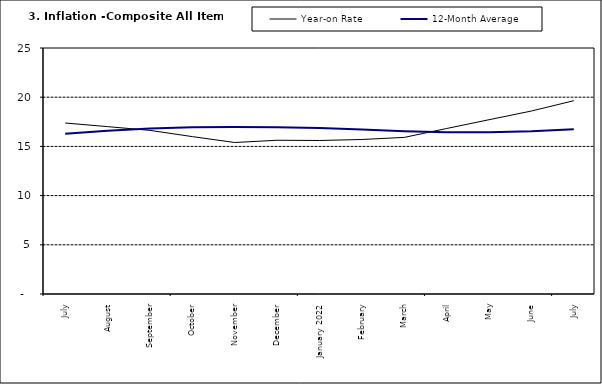
| Category | Year-on Rate | 12-Month Average |
|---|---|---|
| July | 17.377 | 16.298 |
| August | 17.009 | 16.601 |
| September | 16.63 | 16.83 |
| October | 15.994 | 16.958 |
| November | 15.396 | 16.979 |
| December | 15.625 | 16.953 |
| January 2022 | 15.601 | 16.869 |
| February | 15.702 | 16.728 |
| March | 15.915 | 16.544 |
| April | 16.819 | 16.449 |
| May | 17.712 | 16.449 |
| June | 18.596 | 16.542 |
| July | 19.643 | 16.755 |